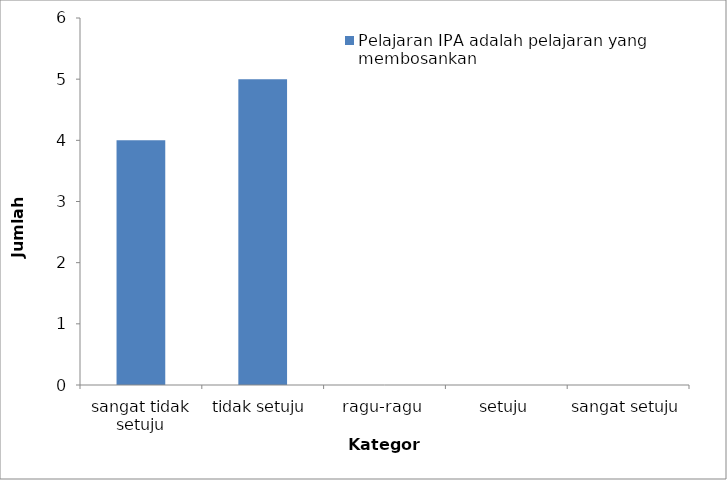
| Category | Pelajaran IPA adalah pelajaran yang membosankan |
|---|---|
| sangat tidak setuju | 4 |
| tidak setuju | 5 |
| ragu-ragu | 0 |
| setuju | 0 |
| sangat setuju | 0 |